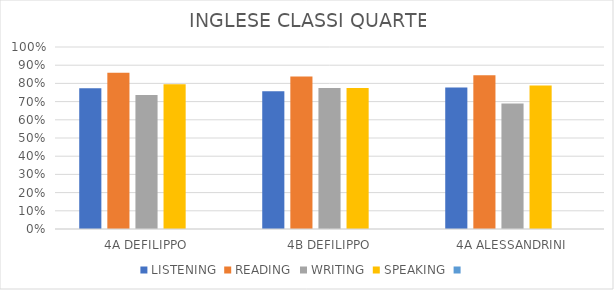
| Category | LISTENING | READING | WRITING | SPEAKING |   |
|---|---|---|---|---|---|
| 4A DEFILIPPO | 0.774 | 0.858 | 0.737 | 0.795 | 0 |
| 4B DEFILIPPO | 0.756 | 0.838 | 0.775 | 0.775 | 0 |
| 4A ALESSANDRINI | 0.778 | 0.844 | 0.689 | 0.789 | 0 |